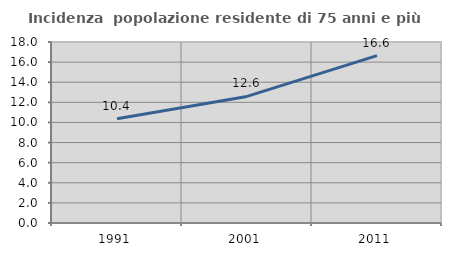
| Category | Incidenza  popolazione residente di 75 anni e più |
|---|---|
| 1991.0 | 10.359 |
| 2001.0 | 12.587 |
| 2011.0 | 16.642 |